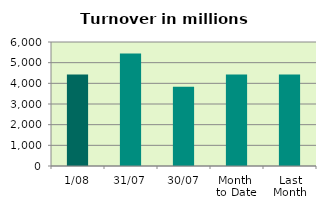
| Category | Series 0 |
|---|---|
| 1/08 | 4423.391 |
| 31/07 | 5444.79 |
| 30/07 | 3837 |
| Month 
to Date | 4423.391 |
| Last
Month | 4433.065 |